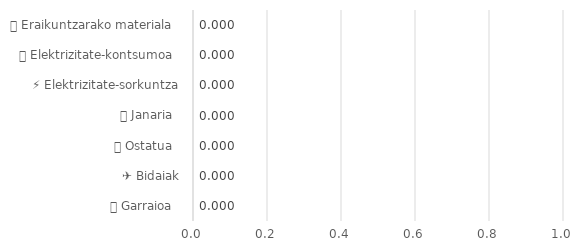
| Category | Series 0 |
|---|---|
| 🚛 Garraioa | 0 |
| ✈️ Bidaiak | 0 |
| 🛌 Ostatua | 0 |
| 🍌 Janaria | 0 |
| ⚡️ Elektrizitate-sorkuntza | 0 |
| 💡 Elektrizitate-kontsumoa | 0 |
| 🛠️ Eraikuntzarako materiala | 0 |